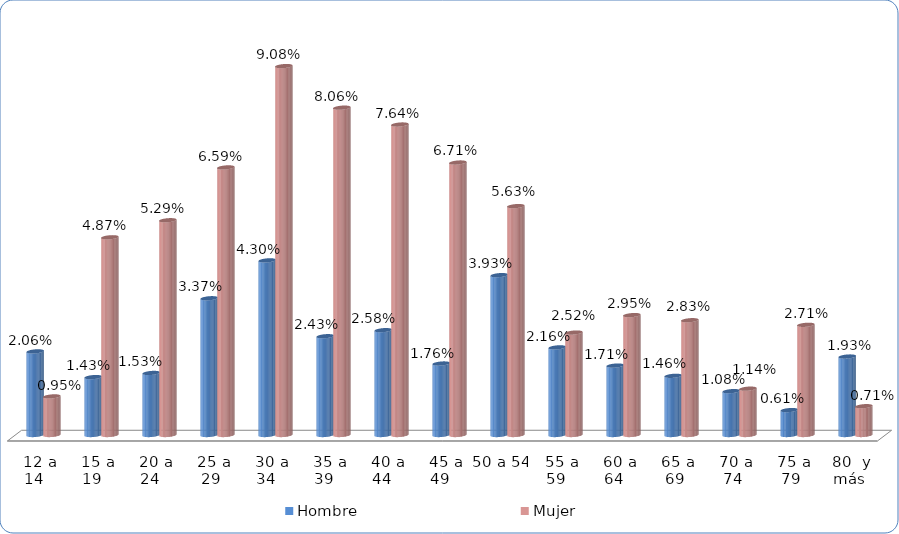
| Category | Hombre | Mujer |
|---|---|---|
|  12 a 14  | 0.021 | 0.01 |
|  15 a 19  | 0.014 | 0.049 |
|  20 a 24  | 0.015 | 0.053 |
|  25 a 29 | 0.034 | 0.066 |
|  30 a 34  | 0.043 | 0.091 |
|  35 a 39  | 0.024 | 0.081 |
|  40 a 44  | 0.026 | 0.076 |
|  45 a 49  | 0.018 | 0.067 |
| 50 a 54  | 0.039 | 0.056 |
|  55 a 59  | 0.022 | 0.025 |
|  60 a 64  | 0.017 | 0.03 |
|  65 a 69 | 0.015 | 0.028 |
|  70 a 74 | 0.011 | 0.011 |
|  75 a 79 | 0.006 | 0.027 |
|  80  y más | 0.019 | 0.007 |